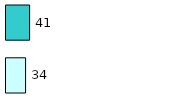
| Category | Series 0 | Series 1 |
|---|---|---|
| 0 | 34 | 41 |